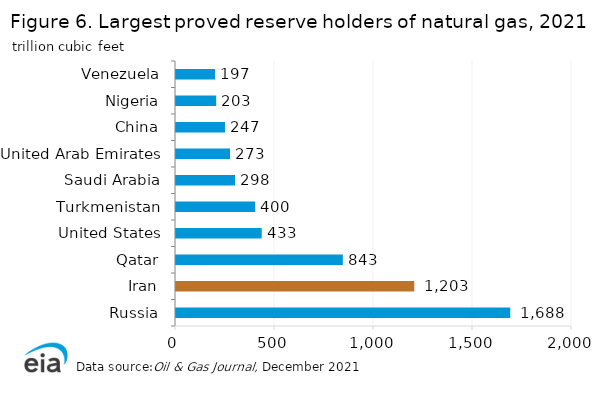
| Category | Series 0 |
|---|---|
| Russia | 1688.228 |
| Iran | 1203.395 |
| Qatar | 842.627 |
| United States | 432.822 |
| Turkmenistan | 400 |
| Saudi Arabia | 297.98 |
| United Arab Emirates | 272.836 |
| China | 247.224 |
| Nigeria | 203.066 |
| Venezuela | 197.405 |